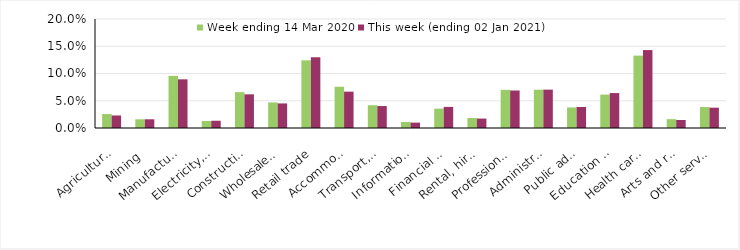
| Category | Week ending 14 Mar 2020 | This week (ending 02 Jan 2021) |
|---|---|---|
| Agriculture, forestry and fishing | 0.026 | 0.023 |
| Mining | 0.016 | 0.016 |
| Manufacturing | 0.096 | 0.089 |
| Electricity, gas, water and waste services | 0.013 | 0.013 |
| Construction | 0.066 | 0.062 |
| Wholesale trade | 0.047 | 0.045 |
| Retail trade | 0.124 | 0.13 |
| Accommodation and food services | 0.076 | 0.067 |
| Transport, postal and warehousing | 0.042 | 0.04 |
| Information media and telecommunications | 0.011 | 0.01 |
| Financial and insurance services | 0.036 | 0.039 |
| Rental, hiring and real estate services | 0.018 | 0.017 |
| Professional, scientific and technical services | 0.07 | 0.069 |
| Administrative and support services | 0.07 | 0.07 |
| Public administration and safety | 0.038 | 0.038 |
| Education and training | 0.061 | 0.064 |
| Health care and social assistance | 0.133 | 0.143 |
| Arts and recreation services | 0.016 | 0.015 |
| Other services | 0.038 | 0.037 |